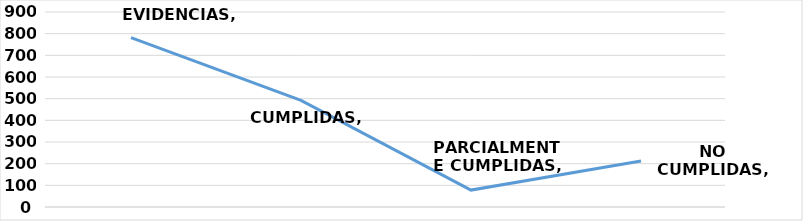
| Category | Series 0 |
|---|---|
| EVIDENCIAS | 782 |
| CUMPLIDAS | 492 |
| PARCIALMENTE CUMPLIDAS | 78 |
| NO CUMPLIDAS | 212 |